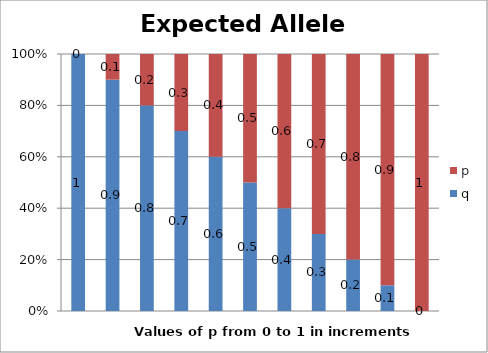
| Category | q | p |
|---|---|---|
| 0 | 1 | 0 |
| 1 | 0.9 | 0.1 |
| 2 | 0.8 | 0.2 |
| 3 | 0.7 | 0.3 |
| 4 | 0.6 | 0.4 |
| 5 | 0.5 | 0.5 |
| 6 | 0.4 | 0.6 |
| 7 | 0.3 | 0.7 |
| 8 | 0.2 | 0.8 |
| 9 | 0.1 | 0.9 |
| 10 | 0 | 1 |